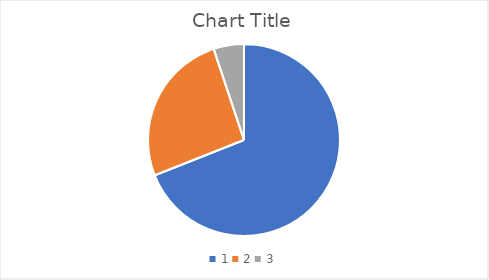
| Category | Series 0 |
|---|---|
| 0 | 20.7 |
| 1 | 7.764 |
| 2 | 1.536 |